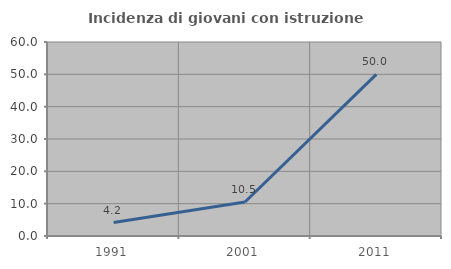
| Category | Incidenza di giovani con istruzione universitaria |
|---|---|
| 1991.0 | 4.167 |
| 2001.0 | 10.526 |
| 2011.0 | 50 |